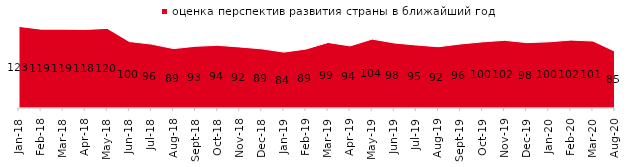
| Category | оценка перспектив развития страны в ближайший год |
|---|---|
| 2018-01-01 | 122.9 |
| 2018-02-01 | 118.7 |
| 2018-03-01 | 118.7 |
| 2018-04-01 | 118.3 |
| 2018-05-01 | 119.9 |
| 2018-06-01 | 100.1 |
| 2018-07-01 | 96.2 |
| 2018-08-01 | 89.45 |
| 2018-09-01 | 92.95 |
| 2018-10-01 | 94.4 |
| 2018-11-01 | 91.916 |
| 2018-12-01 | 89.05 |
| 2019-01-01 | 84.15 |
| 2019-02-01 | 88.75 |
| 2019-03-01 | 98.657 |
| 2019-04-01 | 93.515 |
| 2019-05-01 | 103.764 |
| 2019-06-01 | 97.955 |
| 2019-07-01 | 94.851 |
| 2019-08-01 | 92.308 |
| 2019-09-01 | 96.436 |
| 2019-10-01 | 99.604 |
| 2019-11-01 | 101.931 |
| 2019-12-01 | 98.465 |
| 2020-01-01 | 99.653 |
| 2020-02-01 | 102.277 |
| 2020-03-01 | 100.892 |
| 2020-08-01 | 85.353 |